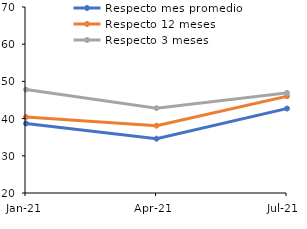
| Category | Respecto mes promedio | Respecto 12 meses | Respecto 3 meses |
|---|---|---|---|
| 2021-01-01 | 38.7 | 40.4 | 47.8 |
| 2021-04-01 | 34.6 | 38.1 | 42.8 |
| 2021-07-01 | 42.7 | 46 | 46.9 |